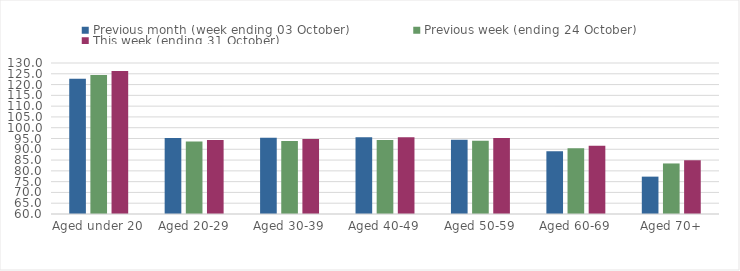
| Category | Previous month (week ending 03 October) | Previous week (ending 24 October) | This week (ending 31 October) |
|---|---|---|---|
| Aged under 20 | 122.67 | 124.38 | 126.28 |
| Aged 20-29 | 95.23 | 93.57 | 94.35 |
| Aged 30-39 | 95.3 | 93.8 | 94.8 |
| Aged 40-49 | 95.53 | 94.33 | 95.58 |
| Aged 50-59 | 94.46 | 93.91 | 95.22 |
| Aged 60-69 | 89.12 | 90.49 | 91.63 |
| Aged 70+ | 77.32 | 83.43 | 84.89 |